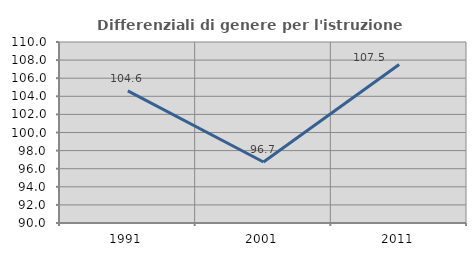
| Category | Differenziali di genere per l'istruzione superiore |
|---|---|
| 1991.0 | 104.598 |
| 2001.0 | 96.737 |
| 2011.0 | 107.516 |